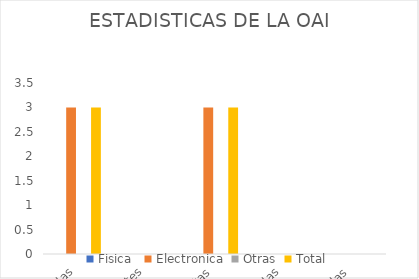
| Category | Fisica  | Electronica | Otras | Total |
|---|---|---|---|---|
| Recibidas | 0 | 3 | 0 | 3 |
| Pendientes | 0 | 0 | 0 | 0 |
| Resueltas | 0 | 3 | 0 | 3 |
| Rechazadas | 0 | 0 | 0 | 0 |
| Transferidas | 0 | 0 | 0 | 0 |